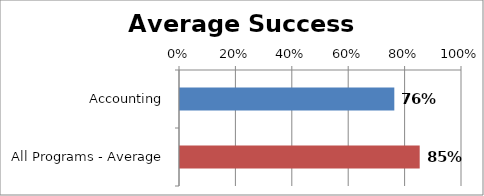
| Category | RetentionRate |
|---|---|
| Accounting | 0.76 |
| All Programs - Average | 0.85 |